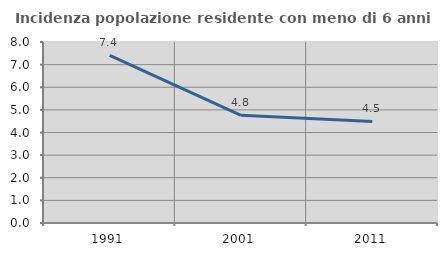
| Category | Incidenza popolazione residente con meno di 6 anni |
|---|---|
| 1991.0 | 7.405 |
| 2001.0 | 4.762 |
| 2011.0 | 4.491 |